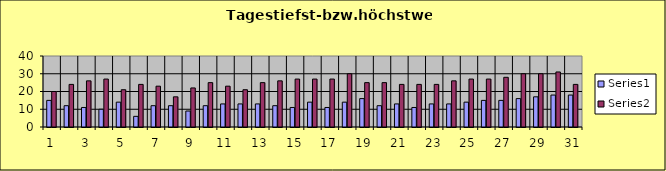
| Category | Series 0 | Series 1 |
|---|---|---|
| 0 | 15 | 20 |
| 1 | 12 | 24 |
| 2 | 11 | 26 |
| 3 | 10 | 27 |
| 4 | 14 | 21 |
| 5 | 6 | 24 |
| 6 | 12 | 23 |
| 7 | 12 | 17 |
| 8 | 9 | 22 |
| 9 | 12 | 25 |
| 10 | 13 | 23 |
| 11 | 13 | 21 |
| 12 | 13 | 25 |
| 13 | 12 | 26 |
| 14 | 11 | 27 |
| 15 | 14 | 27 |
| 16 | 11 | 27 |
| 17 | 14 | 30 |
| 18 | 16 | 25 |
| 19 | 12 | 25 |
| 20 | 13 | 24 |
| 21 | 11 | 24 |
| 22 | 13 | 24 |
| 23 | 13 | 26 |
| 24 | 14 | 27 |
| 25 | 15 | 27 |
| 26 | 15 | 28 |
| 27 | 16 | 30 |
| 28 | 17 | 30 |
| 29 | 18 | 31 |
| 30 | 18 | 24 |